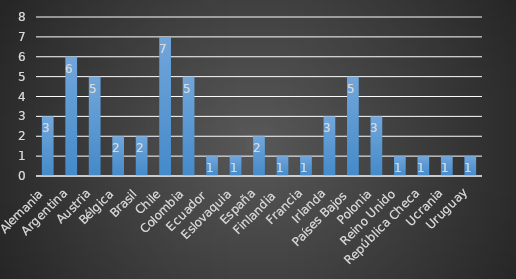
| Category | Series 0 |
|---|---|
| Alemania | 3 |
| Argentina | 6 |
| Austria | 5 |
| Bélgica | 2 |
| Brasil | 2 |
| Chile | 7 |
| Colombia | 5 |
| Ecuador  | 1 |
| Eslovaquia | 1 |
| España | 2 |
| Finlandia  | 1 |
| Francia | 1 |
| Irlanda | 3 |
| Países Bajos | 5 |
| Polonia | 3 |
| Reino Unido | 1 |
| República Checa | 1 |
| Ucrania | 1 |
| Uruguay | 1 |